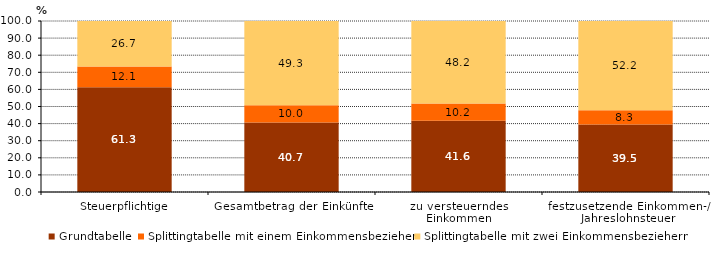
| Category | Grundtabelle | Splittingtabelle mit einem Einkommensbezieher | Splittingtabelle mit zwei Einkommensbeziehern |
|---|---|---|---|
| Steuerpflichtige | 61.3 | 12.1 | 26.7 |
| Gesamtbetrag der Einkünfte | 40.7 | 10 | 49.3 |
| zu versteuerndes 
Einkommen | 41.6 | 10.2 | 48.2 |
| festzusetzende Einkommen-/ Jahreslohnsteuer | 39.5 | 8.3 | 52.2 |